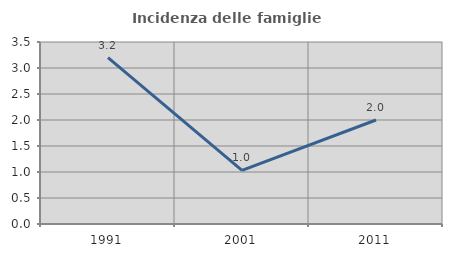
| Category | Incidenza delle famiglie numerose |
|---|---|
| 1991.0 | 3.2 |
| 2001.0 | 1.031 |
| 2011.0 | 2 |